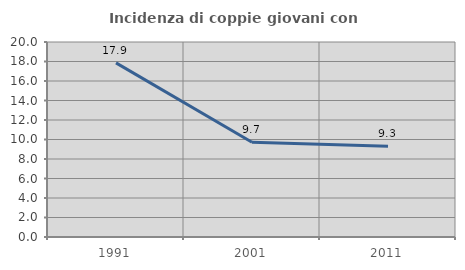
| Category | Incidenza di coppie giovani con figli |
|---|---|
| 1991.0 | 17.857 |
| 2001.0 | 9.72 |
| 2011.0 | 9.301 |